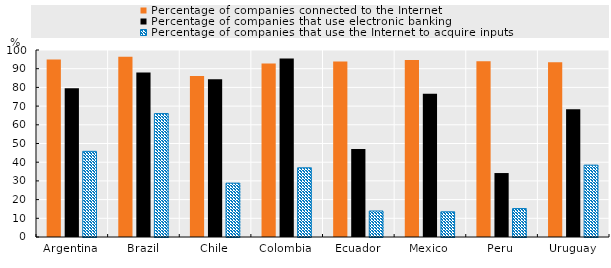
| Category | Percentage of companies connected to the Internet | Percentage of companies that use electronic banking | Percentage of companies that use the Internet to acquire inputs |
|---|---|---|---|
| Argentina | 94.93 | 79.6 | 45.8 |
| Brazil | 96.4 | 88 | 66 |
| Chile | 86.16 | 84.37 | 28.8 |
| Colombia | 92.81 | 95.39 | 37 |
| Ecuador | 93.89 | 47.06 | 13.9 |
| Mexico | 94.61 | 76.6 | 13.47 |
| Peru | 94 | 34.2 | 15.2 |
| Uruguay | 93.39 | 68.35 | 38.43 |